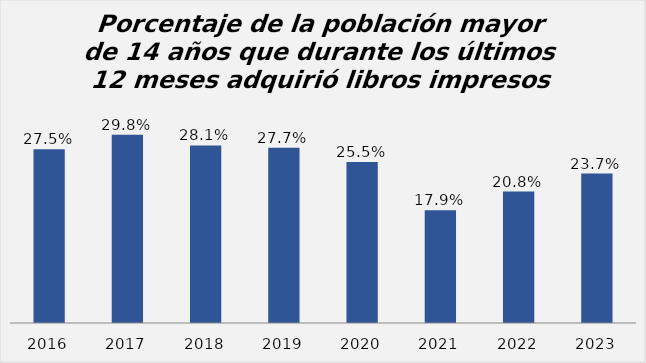
| Category | Series 0 |
|---|---|
| 2016.0 | 0.275 |
| 2017.0 | 0.298 |
| 2018.0 | 0.281 |
| 2019.0 | 0.277 |
| 2020.0 | 0.255 |
| 2021.0 | 0.178 |
| 2022.0 | 0.208 |
| 2023.0 | 0.237 |